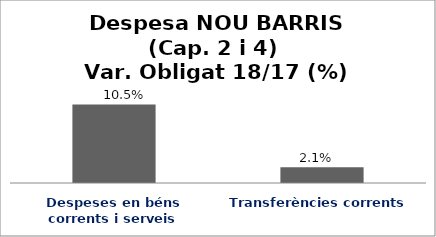
| Category | Series 0 |
|---|---|
| Despeses en béns corrents i serveis | 0.105 |
| Transferències corrents | 0.021 |